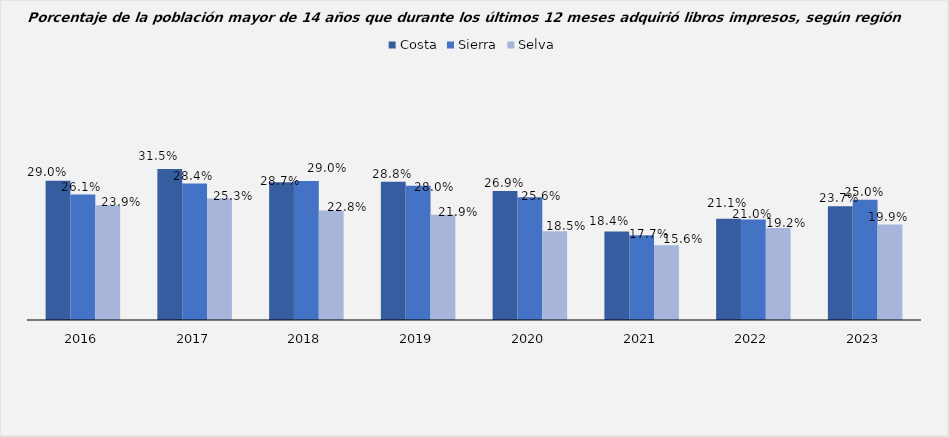
| Category | Costa | Sierra | Selva |
|---|---|---|---|
| 2016.0 | 0.29 | 0.261 | 0.239 |
| 2017.0 | 0.315 | 0.284 | 0.253 |
| 2018.0 | 0.287 | 0.29 | 0.228 |
| 2019.0 | 0.288 | 0.28 | 0.219 |
| 2020.0 | 0.269 | 0.256 | 0.185 |
| 2021.0 | 0.184 | 0.177 | 0.156 |
| 2022.0 | 0.211 | 0.21 | 0.192 |
| 2023.0 | 0.237 | 0.25 | 0.199 |